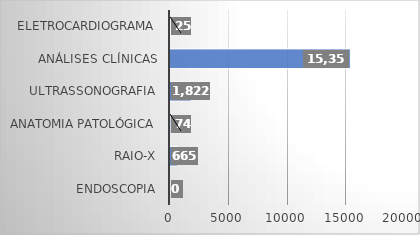
| Category | Series 0 |
|---|---|
| ENDOSCOPIA | 0 |
| RAIO-X | 665 |
| ANATOMIA PATOLÓGICA | 74 |
| ULTRASSONOGRAFIA | 1822 |
| ANÁLISES CLÍNICAS | 15352 |
| ELETROCARDIOGRAMA | 25 |